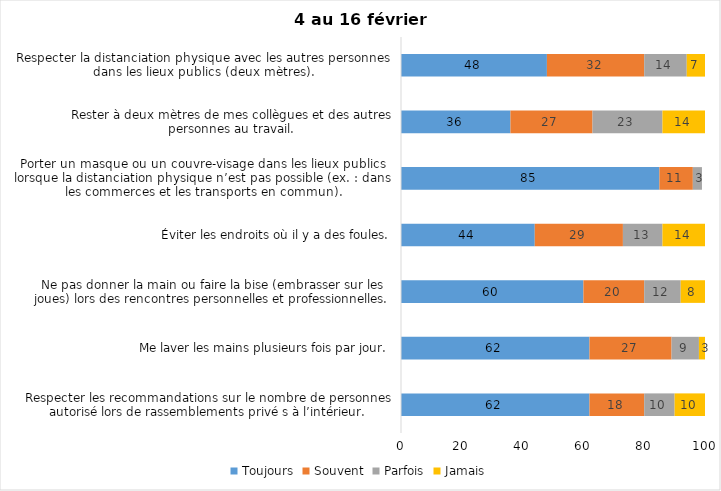
| Category | Toujours | Souvent | Parfois | Jamais |
|---|---|---|---|---|
| Respecter les recommandations sur le nombre de personnes autorisé lors de rassemblements privé s à l’intérieur. | 62 | 18 | 10 | 10 |
| Me laver les mains plusieurs fois par jour. | 62 | 27 | 9 | 3 |
| Ne pas donner la main ou faire la bise (embrasser sur les joues) lors des rencontres personnelles et professionnelles. | 60 | 20 | 12 | 8 |
| Éviter les endroits où il y a des foules. | 44 | 29 | 13 | 14 |
| Porter un masque ou un couvre-visage dans les lieux publics lorsque la distanciation physique n’est pas possible (ex. : dans les commerces et les transports en commun). | 85 | 11 | 3 | 0 |
| Rester à deux mètres de mes collègues et des autres personnes au travail. | 36 | 27 | 23 | 14 |
| Respecter la distanciation physique avec les autres personnes dans les lieux publics (deux mètres). | 48 | 32 | 14 | 7 |